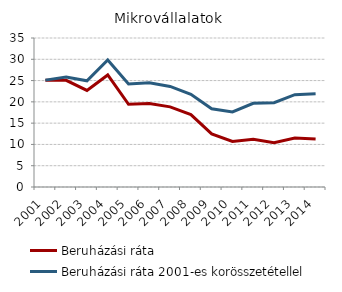
| Category | Beruházási ráta | Beruházási ráta 2001-es korösszetétellel |
|---|---|---|
| 2001.0 | 25.103 | 25.103 |
| 2002.0 | 25.049 | 25.807 |
| 2003.0 | 22.682 | 24.954 |
| 2004.0 | 26.324 | 29.831 |
| 2005.0 | 19.436 | 24.188 |
| 2006.0 | 19.632 | 24.489 |
| 2007.0 | 18.82 | 23.631 |
| 2008.0 | 17 | 21.778 |
| 2009.0 | 12.478 | 18.36 |
| 2010.0 | 10.69 | 17.643 |
| 2011.0 | 11.212 | 19.669 |
| 2012.0 | 10.41 | 19.817 |
| 2013.0 | 11.481 | 21.682 |
| 2014.0 | 11.248 | 21.904 |